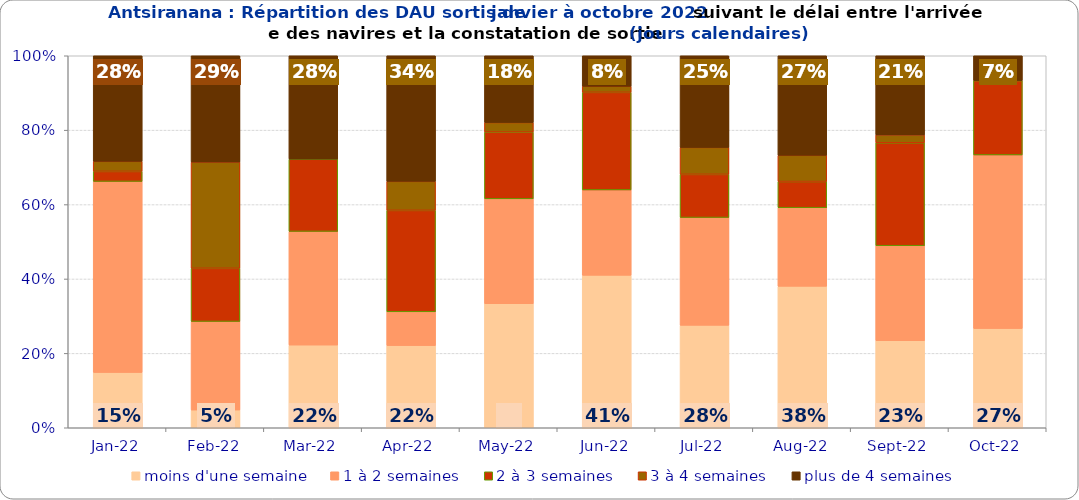
| Category | moins d'une semaine | 1 à 2 semaines | 2 à 3 semaines | 3 à 4 semaines | plus de 4 semaines |
|---|---|---|---|---|---|
| 2022-01-01 | 0.149 | 0.514 | 0.027 | 0.027 | 0.284 |
| 2022-02-01 | 0.048 | 0.238 | 0.143 | 0.286 | 0.286 |
| 2022-03-01 | 0.222 | 0.306 | 0.194 | 0 | 0.278 |
| 2022-04-01 | 0.221 | 0.091 | 0.273 | 0.078 | 0.338 |
| 2022-05-01 | 0.333 | 0.282 | 0.179 | 0.026 | 0.179 |
| 2022-06-01 | 0.41 | 0.23 | 0.262 | 0.016 | 0.082 |
| 2022-07-01 | 0.275 | 0.29 | 0.116 | 0.072 | 0.246 |
| 2022-08-01 | 0.38 | 0.211 | 0.07 | 0.07 | 0.268 |
| 2022-09-01 | 0.234 | 0.255 | 0.277 | 0.021 | 0.213 |
| 2022-10-01 | 0.267 | 0.467 | 0.2 | 0 | 0.067 |